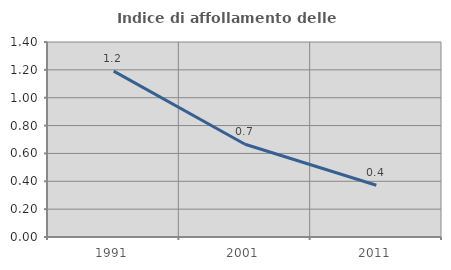
| Category | Indice di affollamento delle abitazioni  |
|---|---|
| 1991.0 | 1.19 |
| 2001.0 | 0.666 |
| 2011.0 | 0.371 |